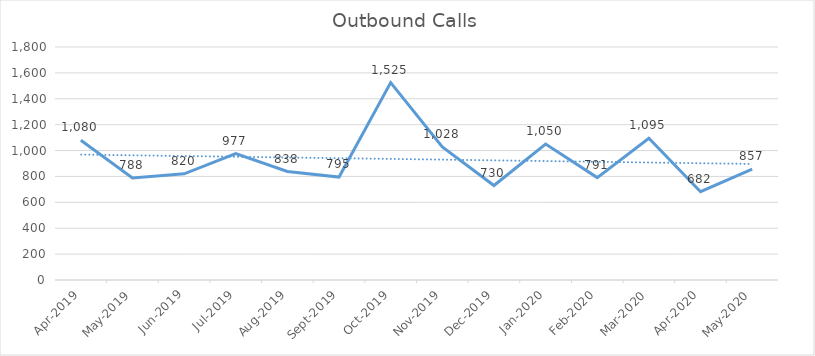
| Category | Series 0 |
|---|---|
| 2019-04-01 | 1080 |
| 2019-05-01 | 788 |
| 2019-06-01 | 820 |
| 2019-07-01 | 977 |
| 2019-08-01 | 838 |
| 2019-09-01 | 795 |
| 2019-10-01 | 1525 |
| 2019-11-01 | 1028 |
| 2019-12-01 | 730 |
| 2020-01-01 | 1050 |
| 2020-02-01 | 791 |
| 2020-03-01 | 1095 |
| 2020-04-01 | 682 |
| 2020-05-01 | 857 |